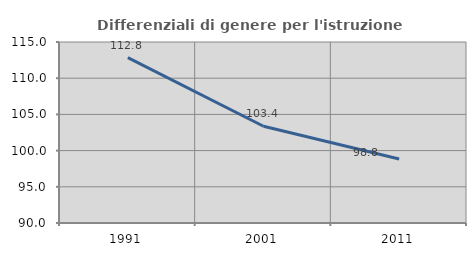
| Category | Differenziali di genere per l'istruzione superiore |
|---|---|
| 1991.0 | 112.831 |
| 2001.0 | 103.366 |
| 2011.0 | 98.833 |